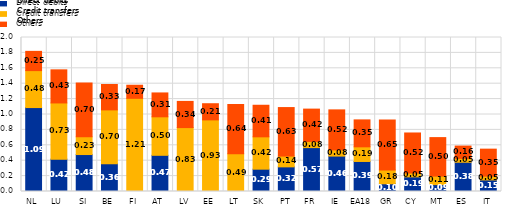
| Category | Direct debits | Credit transfers | Others |
|---|---|---|---|
| NL | 1.09 | 0.48 | 0.25 |
| LU | 0.42 | 0.73 | 0.43 |
| SI | 0.48 | 0.23 | 0.7 |
| BE | 0.36 | 0.7 | 0.33 |
| FI | 0 | 1.21 | 0.17 |
| AT | 0.47 | 0.5 | 0.31 |
| LV | 0 | 0.83 | 0.34 |
| EE | 0 | 0.93 | 0.21 |
| LT | 0 | 0.49 | 0.64 |
| SK | 0.29 | 0.42 | 0.41 |
| PT | 0.32 | 0.14 | 0.63 |
| FR | 0.57 | 0.08 | 0.42 |
| IE | 0.46 | 0.08 | 0.52 |
| EA18 | 0.39 | 0.19 | 0.35 |
| GR | 0.1 | 0.18 | 0.65 |
| CY | 0.19 | 0.05 | 0.52 |
| MT | 0.09 | 0.11 | 0.5 |
| ES | 0.38 | 0.05 | 0.16 |
| IT | 0.15 | 0.05 | 0.35 |